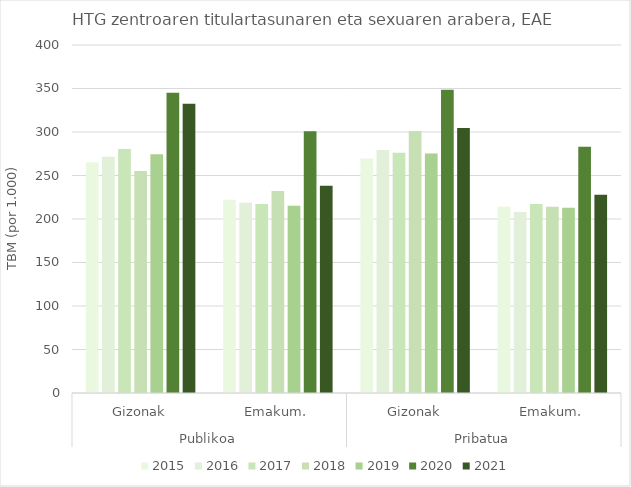
| Category | 2015 | 2016 | 2017 | 2018 | 2019 | 2020 | 2021 |
|---|---|---|---|---|---|---|---|
| 0 | 265.163 | 271.485 | 280.385 | 255.245 | 274.306 | 345.216 | 332.44 |
| 1 | 222.169 | 218.574 | 217.381 | 232.22 | 215.251 | 301.003 | 238.077 |
| 2 | 269.458 | 279.375 | 276.238 | 301.075 | 275.237 | 348.607 | 304.454 |
| 3 | 214.397 | 208.069 | 217.369 | 214.111 | 212.827 | 283.131 | 227.909 |